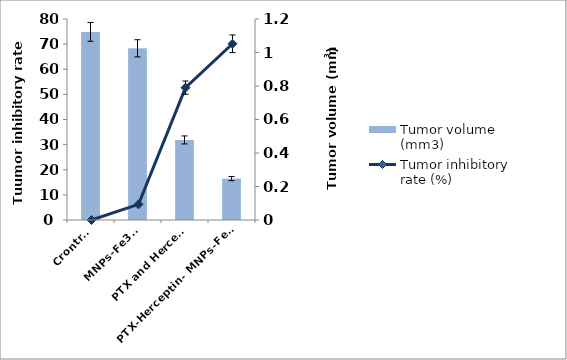
| Category | Tumor volume (mm3) |
|---|---|
| Crontrol | 1.123 |
| MNPs-Fe3O4 | 1.025 |
| PTX and Herceptin | 0.478 |
| PTX-Herceptin- MNPs-Fe3O4  | 0.247 |